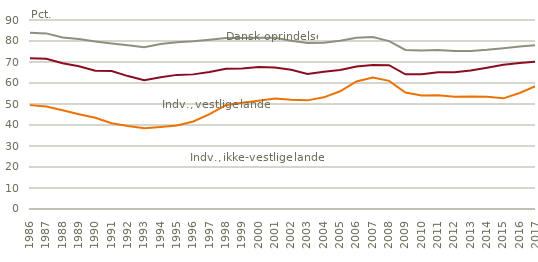
| Category | Personer med dansk oprindelse | Indvandrere fra vestlige lande | Indvandrere fra ikke-vestlige lande |
|---|---|---|---|
| 1986.0 | 83.925 | 71.731 | 49.464 |
| 1987.0 | 83.624 | 71.539 | 48.845 |
| 1988.0 | 81.644 | 69.376 | 46.994 |
| 1989.0 | 80.909 | 67.985 | 45.113 |
| 1990.0 | 79.794 | 65.856 | 43.41 |
| 1991.0 | 78.847 | 65.675 | 40.842 |
| 1992.0 | 77.956 | 63.294 | 39.525 |
| 1993.0 | 77.052 | 61.313 | 38.469 |
| 1994.0 | 78.571 | 62.7 | 39.074 |
| 1995.0 | 79.409 | 63.865 | 39.722 |
| 1996.0 | 79.899 | 64.107 | 41.666 |
| 1997.0 | 80.622 | 65.239 | 45.179 |
| 1998.0 | 81.405 | 66.818 | 49.429 |
| 1999.0 | 81.372 | 66.87 | 50.607 |
| 2000.0 | 81.568 | 67.658 | 51.593 |
| 2001.0 | 81.561 | 67.353 | 52.634 |
| 2002.0 | 80.172 | 66.318 | 52.054 |
| 2003.0 | 79.063 | 64.329 | 51.733 |
| 2004.0 | 79.181 | 65.314 | 53.177 |
| 2005.0 | 80.14 | 66.219 | 56.078 |
| 2006.0 | 81.49 | 67.864 | 60.708 |
| 2007.0 | 81.87 | 68.609 | 62.565 |
| 2008.0 | 79.966 | 68.492 | 61.024 |
| 2009.0 | 75.748 | 64.149 | 55.457 |
| 2010.0 | 75.445 | 64.188 | 54.078 |
| 2011.0 | 75.669 | 65.132 | 54.118 |
| 2012.0 | 75.2 | 65.175 | 53.441 |
| 2013.0 | 75.233 | 65.948 | 53.605 |
| 2014.0 | 75.8 | 67.231 | 53.421 |
| 2015.0 | 76.554 | 68.676 | 52.69 |
| 2016.0 | 77.417 | 69.569 | 55.224 |
| 2017.0 | 78 | 70.2 | 58.6 |